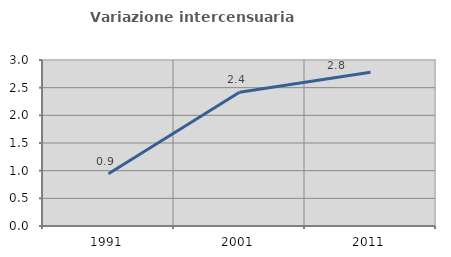
| Category | Variazione intercensuaria annua |
|---|---|
| 1991.0 | 0.944 |
| 2001.0 | 2.417 |
| 2011.0 | 2.777 |